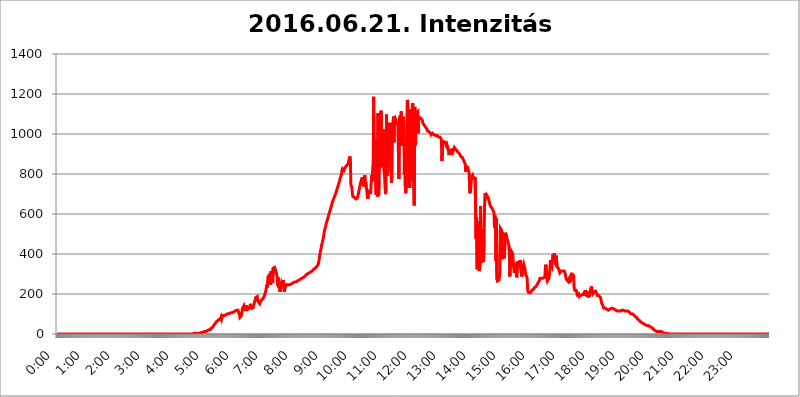
| Category | 2016.06.21. Intenzitás [W/m^2] |
|---|---|
| 0.0 | 0 |
| 0.0006944444444444445 | 0 |
| 0.001388888888888889 | 0 |
| 0.0020833333333333333 | 0 |
| 0.002777777777777778 | 0 |
| 0.003472222222222222 | 0 |
| 0.004166666666666667 | 0 |
| 0.004861111111111111 | 0 |
| 0.005555555555555556 | 0 |
| 0.0062499999999999995 | 0 |
| 0.006944444444444444 | 0 |
| 0.007638888888888889 | 0 |
| 0.008333333333333333 | 0 |
| 0.009027777777777779 | 0 |
| 0.009722222222222222 | 0 |
| 0.010416666666666666 | 0 |
| 0.011111111111111112 | 0 |
| 0.011805555555555555 | 0 |
| 0.012499999999999999 | 0 |
| 0.013194444444444444 | 0 |
| 0.013888888888888888 | 0 |
| 0.014583333333333332 | 0 |
| 0.015277777777777777 | 0 |
| 0.015972222222222224 | 0 |
| 0.016666666666666666 | 0 |
| 0.017361111111111112 | 0 |
| 0.018055555555555557 | 0 |
| 0.01875 | 0 |
| 0.019444444444444445 | 0 |
| 0.02013888888888889 | 0 |
| 0.020833333333333332 | 0 |
| 0.02152777777777778 | 0 |
| 0.022222222222222223 | 0 |
| 0.02291666666666667 | 0 |
| 0.02361111111111111 | 0 |
| 0.024305555555555556 | 0 |
| 0.024999999999999998 | 0 |
| 0.025694444444444447 | 0 |
| 0.02638888888888889 | 0 |
| 0.027083333333333334 | 0 |
| 0.027777777777777776 | 0 |
| 0.02847222222222222 | 0 |
| 0.029166666666666664 | 0 |
| 0.029861111111111113 | 0 |
| 0.030555555555555555 | 0 |
| 0.03125 | 0 |
| 0.03194444444444445 | 0 |
| 0.03263888888888889 | 0 |
| 0.03333333333333333 | 0 |
| 0.034027777777777775 | 0 |
| 0.034722222222222224 | 0 |
| 0.035416666666666666 | 0 |
| 0.036111111111111115 | 0 |
| 0.03680555555555556 | 0 |
| 0.0375 | 0 |
| 0.03819444444444444 | 0 |
| 0.03888888888888889 | 0 |
| 0.03958333333333333 | 0 |
| 0.04027777777777778 | 0 |
| 0.04097222222222222 | 0 |
| 0.041666666666666664 | 0 |
| 0.042361111111111106 | 0 |
| 0.04305555555555556 | 0 |
| 0.043750000000000004 | 0 |
| 0.044444444444444446 | 0 |
| 0.04513888888888889 | 0 |
| 0.04583333333333334 | 0 |
| 0.04652777777777778 | 0 |
| 0.04722222222222222 | 0 |
| 0.04791666666666666 | 0 |
| 0.04861111111111111 | 0 |
| 0.049305555555555554 | 0 |
| 0.049999999999999996 | 0 |
| 0.05069444444444445 | 0 |
| 0.051388888888888894 | 0 |
| 0.052083333333333336 | 0 |
| 0.05277777777777778 | 0 |
| 0.05347222222222222 | 0 |
| 0.05416666666666667 | 0 |
| 0.05486111111111111 | 0 |
| 0.05555555555555555 | 0 |
| 0.05625 | 0 |
| 0.05694444444444444 | 0 |
| 0.057638888888888885 | 0 |
| 0.05833333333333333 | 0 |
| 0.05902777777777778 | 0 |
| 0.059722222222222225 | 0 |
| 0.06041666666666667 | 0 |
| 0.061111111111111116 | 0 |
| 0.06180555555555556 | 0 |
| 0.0625 | 0 |
| 0.06319444444444444 | 0 |
| 0.06388888888888888 | 0 |
| 0.06458333333333334 | 0 |
| 0.06527777777777778 | 0 |
| 0.06597222222222222 | 0 |
| 0.06666666666666667 | 0 |
| 0.06736111111111111 | 0 |
| 0.06805555555555555 | 0 |
| 0.06874999999999999 | 0 |
| 0.06944444444444443 | 0 |
| 0.07013888888888889 | 0 |
| 0.07083333333333333 | 0 |
| 0.07152777777777779 | 0 |
| 0.07222222222222223 | 0 |
| 0.07291666666666667 | 0 |
| 0.07361111111111111 | 0 |
| 0.07430555555555556 | 0 |
| 0.075 | 0 |
| 0.07569444444444444 | 0 |
| 0.0763888888888889 | 0 |
| 0.07708333333333334 | 0 |
| 0.07777777777777778 | 0 |
| 0.07847222222222222 | 0 |
| 0.07916666666666666 | 0 |
| 0.0798611111111111 | 0 |
| 0.08055555555555556 | 0 |
| 0.08125 | 0 |
| 0.08194444444444444 | 0 |
| 0.08263888888888889 | 0 |
| 0.08333333333333333 | 0 |
| 0.08402777777777777 | 0 |
| 0.08472222222222221 | 0 |
| 0.08541666666666665 | 0 |
| 0.08611111111111112 | 0 |
| 0.08680555555555557 | 0 |
| 0.08750000000000001 | 0 |
| 0.08819444444444445 | 0 |
| 0.08888888888888889 | 0 |
| 0.08958333333333333 | 0 |
| 0.09027777777777778 | 0 |
| 0.09097222222222222 | 0 |
| 0.09166666666666667 | 0 |
| 0.09236111111111112 | 0 |
| 0.09305555555555556 | 0 |
| 0.09375 | 0 |
| 0.09444444444444444 | 0 |
| 0.09513888888888888 | 0 |
| 0.09583333333333333 | 0 |
| 0.09652777777777777 | 0 |
| 0.09722222222222222 | 0 |
| 0.09791666666666667 | 0 |
| 0.09861111111111111 | 0 |
| 0.09930555555555555 | 0 |
| 0.09999999999999999 | 0 |
| 0.10069444444444443 | 0 |
| 0.1013888888888889 | 0 |
| 0.10208333333333335 | 0 |
| 0.10277777777777779 | 0 |
| 0.10347222222222223 | 0 |
| 0.10416666666666667 | 0 |
| 0.10486111111111111 | 0 |
| 0.10555555555555556 | 0 |
| 0.10625 | 0 |
| 0.10694444444444444 | 0 |
| 0.1076388888888889 | 0 |
| 0.10833333333333334 | 0 |
| 0.10902777777777778 | 0 |
| 0.10972222222222222 | 0 |
| 0.1111111111111111 | 0 |
| 0.11180555555555556 | 0 |
| 0.11180555555555556 | 0 |
| 0.1125 | 0 |
| 0.11319444444444444 | 0 |
| 0.11388888888888889 | 0 |
| 0.11458333333333333 | 0 |
| 0.11527777777777777 | 0 |
| 0.11597222222222221 | 0 |
| 0.11666666666666665 | 0 |
| 0.1173611111111111 | 0 |
| 0.11805555555555557 | 0 |
| 0.11944444444444445 | 0 |
| 0.12013888888888889 | 0 |
| 0.12083333333333333 | 0 |
| 0.12152777777777778 | 0 |
| 0.12222222222222223 | 0 |
| 0.12291666666666667 | 0 |
| 0.12291666666666667 | 0 |
| 0.12361111111111112 | 0 |
| 0.12430555555555556 | 0 |
| 0.125 | 0 |
| 0.12569444444444444 | 0 |
| 0.12638888888888888 | 0 |
| 0.12708333333333333 | 0 |
| 0.16875 | 0 |
| 0.12847222222222224 | 0 |
| 0.12916666666666668 | 0 |
| 0.12986111111111112 | 0 |
| 0.13055555555555556 | 0 |
| 0.13125 | 0 |
| 0.13194444444444445 | 0 |
| 0.1326388888888889 | 0 |
| 0.13333333333333333 | 0 |
| 0.13402777777777777 | 0 |
| 0.13402777777777777 | 0 |
| 0.13472222222222222 | 0 |
| 0.13541666666666666 | 0 |
| 0.1361111111111111 | 0 |
| 0.13749999999999998 | 0 |
| 0.13819444444444443 | 0 |
| 0.1388888888888889 | 0 |
| 0.13958333333333334 | 0 |
| 0.14027777777777778 | 0 |
| 0.14097222222222222 | 0 |
| 0.14166666666666666 | 0 |
| 0.1423611111111111 | 0 |
| 0.14305555555555557 | 0 |
| 0.14375000000000002 | 0 |
| 0.14444444444444446 | 0 |
| 0.1451388888888889 | 0 |
| 0.1451388888888889 | 0 |
| 0.14652777777777778 | 0 |
| 0.14722222222222223 | 0 |
| 0.14791666666666667 | 0 |
| 0.1486111111111111 | 0 |
| 0.14930555555555555 | 0 |
| 0.15 | 0 |
| 0.15069444444444444 | 0 |
| 0.15138888888888888 | 0 |
| 0.15208333333333332 | 0 |
| 0.15277777777777776 | 0 |
| 0.15347222222222223 | 0 |
| 0.15416666666666667 | 0 |
| 0.15486111111111112 | 0 |
| 0.15555555555555556 | 0 |
| 0.15625 | 0 |
| 0.15694444444444444 | 0 |
| 0.15763888888888888 | 0 |
| 0.15833333333333333 | 0 |
| 0.15902777777777777 | 0 |
| 0.15972222222222224 | 0 |
| 0.16041666666666668 | 0 |
| 0.16111111111111112 | 0 |
| 0.16180555555555556 | 0 |
| 0.1625 | 0 |
| 0.16319444444444445 | 0 |
| 0.1638888888888889 | 0 |
| 0.16458333333333333 | 0 |
| 0.16527777777777777 | 0 |
| 0.16597222222222222 | 0 |
| 0.16666666666666666 | 0 |
| 0.1673611111111111 | 0 |
| 0.16805555555555554 | 0 |
| 0.16874999999999998 | 0 |
| 0.16944444444444443 | 0 |
| 0.17013888888888887 | 0 |
| 0.1708333333333333 | 0 |
| 0.17152777777777775 | 0 |
| 0.17222222222222225 | 0 |
| 0.1729166666666667 | 0 |
| 0.17361111111111113 | 0 |
| 0.17430555555555557 | 0 |
| 0.17500000000000002 | 0 |
| 0.17569444444444446 | 0 |
| 0.1763888888888889 | 0 |
| 0.17708333333333334 | 0 |
| 0.17777777777777778 | 0 |
| 0.17847222222222223 | 0 |
| 0.17916666666666667 | 0 |
| 0.1798611111111111 | 0 |
| 0.18055555555555555 | 0 |
| 0.18125 | 0 |
| 0.18194444444444444 | 0 |
| 0.1826388888888889 | 0 |
| 0.18333333333333335 | 0 |
| 0.1840277777777778 | 0 |
| 0.18472222222222223 | 0 |
| 0.18541666666666667 | 0 |
| 0.18611111111111112 | 0 |
| 0.18680555555555556 | 0 |
| 0.1875 | 0 |
| 0.18819444444444444 | 0 |
| 0.18888888888888888 | 0 |
| 0.18958333333333333 | 0 |
| 0.19027777777777777 | 0 |
| 0.1909722222222222 | 0 |
| 0.19166666666666665 | 3.525 |
| 0.19236111111111112 | 3.525 |
| 0.19305555555555554 | 3.525 |
| 0.19375 | 3.525 |
| 0.19444444444444445 | 3.525 |
| 0.1951388888888889 | 3.525 |
| 0.19583333333333333 | 3.525 |
| 0.19652777777777777 | 3.525 |
| 0.19722222222222222 | 3.525 |
| 0.19791666666666666 | 3.525 |
| 0.1986111111111111 | 3.525 |
| 0.19930555555555554 | 3.525 |
| 0.19999999999999998 | 3.525 |
| 0.20069444444444443 | 3.525 |
| 0.20138888888888887 | 7.887 |
| 0.2020833333333333 | 7.887 |
| 0.2027777777777778 | 7.887 |
| 0.2034722222222222 | 7.887 |
| 0.2041666666666667 | 7.887 |
| 0.20486111111111113 | 7.887 |
| 0.20555555555555557 | 7.887 |
| 0.20625000000000002 | 12.257 |
| 0.20694444444444446 | 12.257 |
| 0.2076388888888889 | 12.257 |
| 0.20833333333333334 | 12.257 |
| 0.20902777777777778 | 12.257 |
| 0.20972222222222223 | 12.257 |
| 0.21041666666666667 | 16.636 |
| 0.2111111111111111 | 16.636 |
| 0.21180555555555555 | 21.024 |
| 0.2125 | 21.024 |
| 0.21319444444444444 | 21.024 |
| 0.2138888888888889 | 21.024 |
| 0.21458333333333335 | 21.024 |
| 0.2152777777777778 | 25.419 |
| 0.21597222222222223 | 29.823 |
| 0.21666666666666667 | 29.823 |
| 0.21736111111111112 | 34.234 |
| 0.21805555555555556 | 34.234 |
| 0.21875 | 38.653 |
| 0.21944444444444444 | 43.079 |
| 0.22013888888888888 | 47.511 |
| 0.22083333333333333 | 47.511 |
| 0.22152777777777777 | 51.951 |
| 0.2222222222222222 | 56.398 |
| 0.22291666666666665 | 60.85 |
| 0.2236111111111111 | 60.85 |
| 0.22430555555555556 | 65.31 |
| 0.225 | 65.31 |
| 0.22569444444444445 | 69.775 |
| 0.2263888888888889 | 69.775 |
| 0.22708333333333333 | 74.246 |
| 0.22777777777777777 | 78.722 |
| 0.22847222222222222 | 78.722 |
| 0.22916666666666666 | 74.246 |
| 0.2298611111111111 | 83.205 |
| 0.23055555555555554 | 74.246 |
| 0.23124999999999998 | 83.205 |
| 0.23194444444444443 | 83.205 |
| 0.23263888888888887 | 92.184 |
| 0.2333333333333333 | 92.184 |
| 0.2340277777777778 | 92.184 |
| 0.2347222222222222 | 92.184 |
| 0.2354166666666667 | 96.682 |
| 0.23611111111111113 | 96.682 |
| 0.23680555555555557 | 96.682 |
| 0.23750000000000002 | 101.184 |
| 0.23819444444444446 | 101.184 |
| 0.2388888888888889 | 101.184 |
| 0.23958333333333334 | 101.184 |
| 0.24027777777777778 | 101.184 |
| 0.24097222222222223 | 101.184 |
| 0.24166666666666667 | 101.184 |
| 0.2423611111111111 | 105.69 |
| 0.24305555555555555 | 105.69 |
| 0.24375 | 105.69 |
| 0.24444444444444446 | 105.69 |
| 0.24513888888888888 | 105.69 |
| 0.24583333333333335 | 110.201 |
| 0.2465277777777778 | 110.201 |
| 0.24722222222222223 | 110.201 |
| 0.24791666666666667 | 110.201 |
| 0.24861111111111112 | 114.716 |
| 0.24930555555555556 | 114.716 |
| 0.25 | 114.716 |
| 0.25069444444444444 | 114.716 |
| 0.2513888888888889 | 119.235 |
| 0.2520833333333333 | 119.235 |
| 0.25277777777777777 | 119.235 |
| 0.2534722222222222 | 119.235 |
| 0.25416666666666665 | 119.235 |
| 0.2548611111111111 | 119.235 |
| 0.2555555555555556 | 96.682 |
| 0.25625000000000003 | 83.205 |
| 0.2569444444444445 | 87.692 |
| 0.2576388888888889 | 87.692 |
| 0.25833333333333336 | 92.184 |
| 0.2590277777777778 | 92.184 |
| 0.25972222222222224 | 128.284 |
| 0.2604166666666667 | 128.284 |
| 0.2611111111111111 | 137.347 |
| 0.26180555555555557 | 123.758 |
| 0.2625 | 132.814 |
| 0.26319444444444445 | 128.284 |
| 0.2638888888888889 | 114.716 |
| 0.26458333333333334 | 110.201 |
| 0.2652777777777778 | 141.884 |
| 0.2659722222222222 | 132.814 |
| 0.26666666666666666 | 128.284 |
| 0.2673611111111111 | 123.758 |
| 0.26805555555555555 | 128.284 |
| 0.26875 | 128.284 |
| 0.26944444444444443 | 128.284 |
| 0.2701388888888889 | 137.347 |
| 0.2708333333333333 | 150.964 |
| 0.27152777777777776 | 137.347 |
| 0.2722222222222222 | 141.884 |
| 0.27291666666666664 | 128.284 |
| 0.2736111111111111 | 128.284 |
| 0.2743055555555555 | 128.284 |
| 0.27499999999999997 | 132.814 |
| 0.27569444444444446 | 146.423 |
| 0.27638888888888885 | 155.509 |
| 0.27708333333333335 | 164.605 |
| 0.2777777777777778 | 169.156 |
| 0.27847222222222223 | 182.82 |
| 0.2791666666666667 | 178.264 |
| 0.2798611111111111 | 182.82 |
| 0.28055555555555556 | 187.378 |
| 0.28125 | 169.156 |
| 0.28194444444444444 | 160.056 |
| 0.2826388888888889 | 155.509 |
| 0.2833333333333333 | 155.509 |
| 0.28402777777777777 | 150.964 |
| 0.2847222222222222 | 155.509 |
| 0.28541666666666665 | 164.605 |
| 0.28611111111111115 | 169.156 |
| 0.28680555555555554 | 169.156 |
| 0.28750000000000003 | 173.709 |
| 0.2881944444444445 | 173.709 |
| 0.2888888888888889 | 178.264 |
| 0.28958333333333336 | 182.82 |
| 0.2902777777777778 | 187.378 |
| 0.29097222222222224 | 196.497 |
| 0.2916666666666667 | 205.62 |
| 0.2923611111111111 | 214.746 |
| 0.29305555555555557 | 223.873 |
| 0.29375 | 246.689 |
| 0.29444444444444445 | 233 |
| 0.2951388888888889 | 260.373 |
| 0.29583333333333334 | 292.259 |
| 0.2965277777777778 | 283.156 |
| 0.2972222222222222 | 292.259 |
| 0.29791666666666666 | 301.354 |
| 0.2986111111111111 | 305.898 |
| 0.29930555555555555 | 246.689 |
| 0.3 | 314.98 |
| 0.30069444444444443 | 310.44 |
| 0.3013888888888889 | 314.98 |
| 0.3020833333333333 | 255.813 |
| 0.30277777777777776 | 328.584 |
| 0.3034722222222222 | 324.052 |
| 0.30416666666666664 | 333.113 |
| 0.3048611111111111 | 333.113 |
| 0.3055555555555555 | 328.584 |
| 0.30624999999999997 | 328.584 |
| 0.3069444444444444 | 310.44 |
| 0.3076388888888889 | 314.98 |
| 0.30833333333333335 | 287.709 |
| 0.3090277777777778 | 242.127 |
| 0.30972222222222223 | 283.156 |
| 0.3104166666666667 | 233 |
| 0.3111111111111111 | 260.373 |
| 0.31180555555555556 | 228.436 |
| 0.3125 | 210.182 |
| 0.31319444444444444 | 233 |
| 0.3138888888888889 | 242.127 |
| 0.3145833333333333 | 255.813 |
| 0.31527777777777777 | 260.373 |
| 0.3159722222222222 | 242.127 |
| 0.31666666666666665 | 269.49 |
| 0.31736111111111115 | 274.047 |
| 0.31805555555555554 | 264.932 |
| 0.31875000000000003 | 210.182 |
| 0.3194444444444445 | 251.251 |
| 0.3201388888888889 | 237.564 |
| 0.32083333333333336 | 233 |
| 0.3215277777777778 | 242.127 |
| 0.32222222222222224 | 246.689 |
| 0.3229166666666667 | 242.127 |
| 0.3236111111111111 | 242.127 |
| 0.32430555555555557 | 246.689 |
| 0.325 | 246.689 |
| 0.32569444444444445 | 246.689 |
| 0.3263888888888889 | 246.689 |
| 0.32708333333333334 | 251.251 |
| 0.3277777777777778 | 251.251 |
| 0.3284722222222222 | 251.251 |
| 0.32916666666666666 | 255.813 |
| 0.3298611111111111 | 255.813 |
| 0.33055555555555555 | 255.813 |
| 0.33125 | 255.813 |
| 0.33194444444444443 | 260.373 |
| 0.3326388888888889 | 260.373 |
| 0.3333333333333333 | 260.373 |
| 0.3340277777777778 | 260.373 |
| 0.3347222222222222 | 260.373 |
| 0.3354166666666667 | 260.373 |
| 0.3361111111111111 | 264.932 |
| 0.3368055555555556 | 264.932 |
| 0.33749999999999997 | 269.49 |
| 0.33819444444444446 | 269.49 |
| 0.33888888888888885 | 269.49 |
| 0.33958333333333335 | 269.49 |
| 0.34027777777777773 | 274.047 |
| 0.34097222222222223 | 274.047 |
| 0.3416666666666666 | 274.047 |
| 0.3423611111111111 | 278.603 |
| 0.3430555555555555 | 278.603 |
| 0.34375 | 278.603 |
| 0.3444444444444445 | 283.156 |
| 0.3451388888888889 | 283.156 |
| 0.3458333333333334 | 287.709 |
| 0.34652777777777777 | 287.709 |
| 0.34722222222222227 | 287.709 |
| 0.34791666666666665 | 292.259 |
| 0.34861111111111115 | 292.259 |
| 0.34930555555555554 | 296.808 |
| 0.35000000000000003 | 296.808 |
| 0.3506944444444444 | 301.354 |
| 0.3513888888888889 | 301.354 |
| 0.3520833333333333 | 301.354 |
| 0.3527777777777778 | 305.898 |
| 0.3534722222222222 | 305.898 |
| 0.3541666666666667 | 305.898 |
| 0.3548611111111111 | 310.44 |
| 0.35555555555555557 | 310.44 |
| 0.35625 | 310.44 |
| 0.35694444444444445 | 314.98 |
| 0.3576388888888889 | 314.98 |
| 0.35833333333333334 | 319.517 |
| 0.3590277777777778 | 319.517 |
| 0.3597222222222222 | 324.052 |
| 0.36041666666666666 | 324.052 |
| 0.3611111111111111 | 324.052 |
| 0.36180555555555555 | 328.584 |
| 0.3625 | 333.113 |
| 0.36319444444444443 | 333.113 |
| 0.3638888888888889 | 337.639 |
| 0.3645833333333333 | 337.639 |
| 0.3652777777777778 | 342.162 |
| 0.3659722222222222 | 346.682 |
| 0.3666666666666667 | 360.221 |
| 0.3673611111111111 | 373.729 |
| 0.3680555555555556 | 391.685 |
| 0.36874999999999997 | 405.108 |
| 0.36944444444444446 | 418.492 |
| 0.37013888888888885 | 431.833 |
| 0.37083333333333335 | 445.129 |
| 0.37152777777777773 | 453.968 |
| 0.37222222222222223 | 462.786 |
| 0.3729166666666666 | 475.972 |
| 0.3736111111111111 | 489.108 |
| 0.3743055555555555 | 506.542 |
| 0.375 | 519.555 |
| 0.3756944444444445 | 528.2 |
| 0.3763888888888889 | 536.82 |
| 0.3770833333333334 | 549.704 |
| 0.37777777777777777 | 558.261 |
| 0.37847222222222227 | 566.793 |
| 0.37916666666666665 | 575.299 |
| 0.37986111111111115 | 583.779 |
| 0.38055555555555554 | 592.233 |
| 0.38125000000000003 | 600.661 |
| 0.3819444444444444 | 609.062 |
| 0.3826388888888889 | 617.436 |
| 0.3833333333333333 | 625.784 |
| 0.3840277777777778 | 634.105 |
| 0.3847222222222222 | 642.4 |
| 0.3854166666666667 | 654.791 |
| 0.3861111111111111 | 658.909 |
| 0.38680555555555557 | 667.123 |
| 0.3875 | 675.311 |
| 0.38819444444444445 | 679.395 |
| 0.3888888888888889 | 687.544 |
| 0.38958333333333334 | 691.608 |
| 0.3902777777777778 | 699.717 |
| 0.3909722222222222 | 707.8 |
| 0.39166666666666666 | 715.858 |
| 0.3923611111111111 | 723.889 |
| 0.39305555555555555 | 731.896 |
| 0.39375 | 739.877 |
| 0.39444444444444443 | 747.834 |
| 0.3951388888888889 | 755.766 |
| 0.3958333333333333 | 763.674 |
| 0.3965277777777778 | 775.492 |
| 0.3972222222222222 | 783.342 |
| 0.3979166666666667 | 791.169 |
| 0.3986111111111111 | 798.974 |
| 0.3993055555555556 | 818.392 |
| 0.39999999999999997 | 826.123 |
| 0.40069444444444446 | 826.123 |
| 0.40138888888888885 | 826.123 |
| 0.40208333333333335 | 818.392 |
| 0.40277777777777773 | 826.123 |
| 0.40347222222222223 | 829.981 |
| 0.4041666666666666 | 833.834 |
| 0.4048611111111111 | 837.682 |
| 0.4055555555555555 | 841.526 |
| 0.40625 | 845.365 |
| 0.4069444444444445 | 845.365 |
| 0.4076388888888889 | 849.199 |
| 0.4083333333333334 | 856.855 |
| 0.40902777777777777 | 868.305 |
| 0.40972222222222227 | 872.114 |
| 0.41041666666666665 | 887.309 |
| 0.41111111111111115 | 864.493 |
| 0.41180555555555554 | 747.834 |
| 0.41250000000000003 | 743.859 |
| 0.4131944444444444 | 731.896 |
| 0.4138888888888889 | 703.762 |
| 0.4145833333333333 | 687.544 |
| 0.4152777777777778 | 683.473 |
| 0.4159722222222222 | 683.473 |
| 0.4166666666666667 | 683.473 |
| 0.4173611111111111 | 687.544 |
| 0.41805555555555557 | 683.473 |
| 0.41875 | 675.311 |
| 0.41944444444444445 | 671.22 |
| 0.4201388888888889 | 675.311 |
| 0.42083333333333334 | 679.395 |
| 0.4215277777777778 | 687.544 |
| 0.4222222222222222 | 699.717 |
| 0.42291666666666666 | 711.832 |
| 0.4236111111111111 | 723.889 |
| 0.42430555555555555 | 735.89 |
| 0.425 | 751.803 |
| 0.42569444444444443 | 759.723 |
| 0.4263888888888889 | 755.766 |
| 0.4270833333333333 | 763.674 |
| 0.4277777777777778 | 783.342 |
| 0.4284722222222222 | 743.859 |
| 0.4291666666666667 | 743.859 |
| 0.4298611111111111 | 783.342 |
| 0.4305555555555556 | 735.89 |
| 0.43124999999999997 | 795.074 |
| 0.43194444444444446 | 735.89 |
| 0.43263888888888885 | 759.723 |
| 0.43333333333333335 | 739.877 |
| 0.43402777777777773 | 719.877 |
| 0.43472222222222223 | 723.889 |
| 0.4354166666666666 | 675.311 |
| 0.4361111111111111 | 687.544 |
| 0.4368055555555555 | 687.544 |
| 0.4375 | 711.832 |
| 0.4381944444444445 | 715.858 |
| 0.4388888888888889 | 711.832 |
| 0.4395833333333334 | 707.8 |
| 0.44027777777777777 | 703.762 |
| 0.44097222222222227 | 795.074 |
| 0.44166666666666665 | 763.674 |
| 0.44236111111111115 | 763.674 |
| 0.44305555555555554 | 841.526 |
| 0.44375000000000003 | 1186.03 |
| 0.4444444444444444 | 917.534 |
| 0.4451388888888889 | 856.855 |
| 0.4458333333333333 | 841.526 |
| 0.4465277777777778 | 759.723 |
| 0.4472222222222222 | 695.666 |
| 0.4479166666666667 | 691.608 |
| 0.4486111111111111 | 973.772 |
| 0.44930555555555557 | 687.544 |
| 0.45 | 1105.019 |
| 0.45069444444444445 | 691.608 |
| 0.4513888888888889 | 771.559 |
| 0.45208333333333334 | 875.918 |
| 0.4527777777777778 | 1014.852 |
| 0.4534722222222222 | 917.534 |
| 0.45416666666666666 | 1116.426 |
| 0.4548611111111111 | 833.834 |
| 0.45555555555555555 | 902.447 |
| 0.45625 | 887.309 |
| 0.45694444444444443 | 1022.323 |
| 0.4576388888888889 | 845.365 |
| 0.4583333333333333 | 818.392 |
| 0.4590277777777778 | 798.974 |
| 0.4597222222222222 | 735.89 |
| 0.4604166666666667 | 699.717 |
| 0.4611111111111111 | 727.896 |
| 0.4618055555555556 | 1097.437 |
| 0.46249999999999997 | 791.169 |
| 0.46319444444444446 | 818.392 |
| 0.46388888888888885 | 810.641 |
| 0.46458333333333335 | 1029.798 |
| 0.46527777777777773 | 868.305 |
| 0.46597222222222223 | 1044.762 |
| 0.4666666666666666 | 1056.004 |
| 0.4673611111111111 | 962.555 |
| 0.4680555555555555 | 826.123 |
| 0.46875 | 755.766 |
| 0.4694444444444445 | 791.169 |
| 0.4701388888888889 | 1052.255 |
| 0.4708333333333334 | 984.98 |
| 0.47152777777777777 | 1086.097 |
| 0.47222222222222227 | 958.814 |
| 0.47291666666666665 | 1089.873 |
| 0.47361111111111115 | 1067.267 |
| 0.47430555555555554 | 1074.789 |
| 0.47500000000000003 | 1067.267 |
| 0.4756944444444444 | 1056.004 |
| 0.4763888888888889 | 1056.004 |
| 0.4770833333333333 | 1052.255 |
| 0.4777777777777778 | 1048.508 |
| 0.4784722222222222 | 902.447 |
| 0.4791666666666667 | 775.492 |
| 0.4798611111111111 | 1078.555 |
| 0.48055555555555557 | 1078.555 |
| 0.48125 | 1093.653 |
| 0.48194444444444445 | 1074.789 |
| 0.4826388888888889 | 1112.618 |
| 0.48333333333333334 | 940.082 |
| 0.4840277777777778 | 1026.06 |
| 0.4847222222222222 | 1011.118 |
| 0.48541666666666666 | 1086.097 |
| 0.4861111111111111 | 1037.277 |
| 0.48680555555555555 | 798.974 |
| 0.4875 | 883.516 |
| 0.48819444444444443 | 739.877 |
| 0.4888888888888889 | 703.762 |
| 0.4895833333333333 | 798.974 |
| 0.4902777777777778 | 1033.537 |
| 0.4909722222222222 | 1170.358 |
| 0.4916666666666667 | 1158.689 |
| 0.4923611111111111 | 1112.618 |
| 0.4930555555555556 | 731.896 |
| 0.49374999999999997 | 747.834 |
| 0.49444444444444446 | 731.896 |
| 0.49513888888888885 | 1124.056 |
| 0.49583333333333335 | 1067.267 |
| 0.49652777777777773 | 763.674 |
| 0.49722222222222223 | 856.855 |
| 0.4979166666666666 | 1014.852 |
| 0.4986111111111111 | 1154.814 |
| 0.4993055555555555 | 917.534 |
| 0.5 | 719.877 |
| 0.5006944444444444 | 642.4 |
| 0.5013888888888889 | 1135.543 |
| 0.5020833333333333 | 943.832 |
| 0.5027777777777778 | 955.071 |
| 0.5034722222222222 | 1105.019 |
| 0.5041666666666667 | 1108.816 |
| 0.5048611111111111 | 1101.226 |
| 0.5055555555555555 | 1112.618 |
| 0.50625 | 1003.65 |
| 0.5069444444444444 | 1089.873 |
| 0.5076388888888889 | 1078.555 |
| 0.5083333333333333 | 1082.324 |
| 0.5090277777777777 | 1078.555 |
| 0.5097222222222222 | 1078.555 |
| 0.5104166666666666 | 1078.555 |
| 0.5111111111111112 | 1074.789 |
| 0.5118055555555555 | 1071.027 |
| 0.5125000000000001 | 1059.756 |
| 0.5131944444444444 | 1052.255 |
| 0.513888888888889 | 1048.508 |
| 0.5145833333333333 | 1044.762 |
| 0.5152777777777778 | 1041.019 |
| 0.5159722222222222 | 1037.277 |
| 0.5166666666666667 | 1033.537 |
| 0.517361111111111 | 1029.798 |
| 0.5180555555555556 | 1029.798 |
| 0.5187499999999999 | 1022.323 |
| 0.5194444444444445 | 1014.852 |
| 0.5201388888888888 | 1014.852 |
| 0.5208333333333334 | 1014.852 |
| 0.5215277777777778 | 1011.118 |
| 0.5222222222222223 | 1007.383 |
| 0.5229166666666667 | 1007.383 |
| 0.5236111111111111 | 1003.65 |
| 0.5243055555555556 | 996.182 |
| 0.525 | 999.916 |
| 0.5256944444444445 | 999.916 |
| 0.5263888888888889 | 1003.65 |
| 0.5270833333333333 | 999.916 |
| 0.5277777777777778 | 999.916 |
| 0.5284722222222222 | 996.182 |
| 0.5291666666666667 | 996.182 |
| 0.5298611111111111 | 996.182 |
| 0.5305555555555556 | 992.448 |
| 0.53125 | 988.714 |
| 0.5319444444444444 | 988.714 |
| 0.5326388888888889 | 992.448 |
| 0.5333333333333333 | 992.448 |
| 0.5340277777777778 | 988.714 |
| 0.5347222222222222 | 984.98 |
| 0.5354166666666667 | 984.98 |
| 0.5361111111111111 | 984.98 |
| 0.5368055555555555 | 984.98 |
| 0.5375 | 981.244 |
| 0.5381944444444444 | 977.508 |
| 0.5388888888888889 | 962.555 |
| 0.5395833333333333 | 864.493 |
| 0.5402777777777777 | 947.58 |
| 0.5409722222222222 | 955.071 |
| 0.5416666666666666 | 962.555 |
| 0.5423611111111112 | 962.555 |
| 0.5430555555555555 | 958.814 |
| 0.5437500000000001 | 958.814 |
| 0.5444444444444444 | 955.071 |
| 0.545138888888889 | 955.071 |
| 0.5458333333333333 | 940.082 |
| 0.5465277777777778 | 947.58 |
| 0.5472222222222222 | 947.58 |
| 0.5479166666666667 | 943.832 |
| 0.548611111111111 | 925.06 |
| 0.5493055555555556 | 894.885 |
| 0.5499999999999999 | 898.668 |
| 0.5506944444444445 | 913.766 |
| 0.5513888888888888 | 898.668 |
| 0.5520833333333334 | 921.298 |
| 0.5527777777777778 | 898.668 |
| 0.5534722222222223 | 925.06 |
| 0.5541666666666667 | 917.534 |
| 0.5548611111111111 | 928.819 |
| 0.5555555555555556 | 917.534 |
| 0.55625 | 925.06 |
| 0.5569444444444445 | 932.576 |
| 0.5576388888888889 | 928.819 |
| 0.5583333333333333 | 925.06 |
| 0.5590277777777778 | 925.06 |
| 0.5597222222222222 | 921.298 |
| 0.5604166666666667 | 917.534 |
| 0.5611111111111111 | 917.534 |
| 0.5618055555555556 | 909.996 |
| 0.5625 | 906.223 |
| 0.5631944444444444 | 906.223 |
| 0.5638888888888889 | 902.447 |
| 0.5645833333333333 | 898.668 |
| 0.5652777777777778 | 894.885 |
| 0.5659722222222222 | 887.309 |
| 0.5666666666666667 | 887.309 |
| 0.5673611111111111 | 883.516 |
| 0.5680555555555555 | 883.516 |
| 0.56875 | 875.918 |
| 0.5694444444444444 | 875.918 |
| 0.5701388888888889 | 868.305 |
| 0.5708333333333333 | 860.676 |
| 0.5715277777777777 | 860.676 |
| 0.5722222222222222 | 849.199 |
| 0.5729166666666666 | 810.641 |
| 0.5736111111111112 | 837.682 |
| 0.5743055555555555 | 837.682 |
| 0.5750000000000001 | 837.682 |
| 0.5756944444444444 | 833.834 |
| 0.576388888888889 | 833.834 |
| 0.5770833333333333 | 829.981 |
| 0.5777777777777778 | 802.868 |
| 0.5784722222222222 | 703.762 |
| 0.5791666666666667 | 707.8 |
| 0.579861111111111 | 719.877 |
| 0.5805555555555556 | 759.723 |
| 0.5812499999999999 | 787.258 |
| 0.5819444444444445 | 787.258 |
| 0.5826388888888888 | 795.074 |
| 0.5833333333333334 | 787.258 |
| 0.5840277777777778 | 787.258 |
| 0.5847222222222223 | 783.342 |
| 0.5854166666666667 | 775.492 |
| 0.5861111111111111 | 783.342 |
| 0.5868055555555556 | 783.342 |
| 0.5875 | 475.972 |
| 0.5881944444444445 | 583.779 |
| 0.5888888888888889 | 324.052 |
| 0.5895833333333333 | 342.162 |
| 0.5902777777777778 | 562.53 |
| 0.5909722222222222 | 328.584 |
| 0.5916666666666667 | 314.98 |
| 0.5923611111111111 | 324.052 |
| 0.5930555555555556 | 337.639 |
| 0.59375 | 638.256 |
| 0.5944444444444444 | 369.23 |
| 0.5951388888888889 | 355.712 |
| 0.5958333333333333 | 391.685 |
| 0.5965277777777778 | 378.224 |
| 0.5972222222222222 | 523.88 |
| 0.5979166666666667 | 360.221 |
| 0.5986111111111111 | 475.972 |
| 0.5993055555555555 | 638.256 |
| 0.6 | 703.762 |
| 0.6006944444444444 | 699.717 |
| 0.6013888888888889 | 687.544 |
| 0.6020833333333333 | 695.666 |
| 0.6027777777777777 | 691.608 |
| 0.6034722222222222 | 687.544 |
| 0.6041666666666666 | 683.473 |
| 0.6048611111111112 | 675.311 |
| 0.6055555555555555 | 667.123 |
| 0.6062500000000001 | 654.791 |
| 0.6069444444444444 | 646.537 |
| 0.607638888888889 | 638.256 |
| 0.6083333333333333 | 634.105 |
| 0.6090277777777778 | 634.105 |
| 0.6097222222222222 | 629.948 |
| 0.6104166666666667 | 625.784 |
| 0.611111111111111 | 617.436 |
| 0.6118055555555556 | 617.436 |
| 0.6124999999999999 | 609.062 |
| 0.6131944444444445 | 532.513 |
| 0.6138888888888888 | 592.233 |
| 0.6145833333333334 | 545.416 |
| 0.6152777777777778 | 364.728 |
| 0.6159722222222223 | 579.542 |
| 0.6166666666666667 | 274.047 |
| 0.6173611111111111 | 264.932 |
| 0.6180555555555556 | 264.932 |
| 0.61875 | 264.932 |
| 0.6194444444444445 | 269.49 |
| 0.6201388888888889 | 274.047 |
| 0.6208333333333333 | 301.354 |
| 0.6215277777777778 | 528.2 |
| 0.6222222222222222 | 523.88 |
| 0.6229166666666667 | 519.555 |
| 0.6236111111111111 | 506.542 |
| 0.6243055555555556 | 373.729 |
| 0.625 | 502.192 |
| 0.6256944444444444 | 506.542 |
| 0.6263888888888889 | 493.475 |
| 0.6270833333333333 | 378.224 |
| 0.6277777777777778 | 458.38 |
| 0.6284722222222222 | 506.542 |
| 0.6291666666666667 | 502.192 |
| 0.6298611111111111 | 493.475 |
| 0.6305555555555555 | 480.356 |
| 0.63125 | 471.582 |
| 0.6319444444444444 | 462.786 |
| 0.6326388888888889 | 453.968 |
| 0.6333333333333333 | 445.129 |
| 0.6340277777777777 | 405.108 |
| 0.6347222222222222 | 287.709 |
| 0.6354166666666666 | 287.709 |
| 0.6361111111111112 | 378.224 |
| 0.6368055555555555 | 414.035 |
| 0.6375000000000001 | 414.035 |
| 0.6381944444444444 | 409.574 |
| 0.638888888888889 | 400.638 |
| 0.6395833333333333 | 360.221 |
| 0.6402777777777778 | 328.584 |
| 0.6409722222222222 | 305.898 |
| 0.6416666666666667 | 314.98 |
| 0.642361111111111 | 346.682 |
| 0.6430555555555556 | 355.712 |
| 0.6437499999999999 | 328.584 |
| 0.6444444444444445 | 283.156 |
| 0.6451388888888888 | 342.162 |
| 0.6458333333333334 | 364.728 |
| 0.6465277777777778 | 364.728 |
| 0.6472222222222223 | 360.221 |
| 0.6479166666666667 | 346.682 |
| 0.6486111111111111 | 328.584 |
| 0.6493055555555556 | 369.23 |
| 0.65 | 369.23 |
| 0.6506944444444445 | 369.23 |
| 0.6513888888888889 | 287.709 |
| 0.6520833333333333 | 287.709 |
| 0.6527777777777778 | 319.517 |
| 0.6534722222222222 | 342.162 |
| 0.6541666666666667 | 351.198 |
| 0.6548611111111111 | 346.682 |
| 0.6555555555555556 | 333.113 |
| 0.65625 | 319.517 |
| 0.6569444444444444 | 296.808 |
| 0.6576388888888889 | 296.808 |
| 0.6583333333333333 | 287.709 |
| 0.6590277777777778 | 278.603 |
| 0.6597222222222222 | 223.873 |
| 0.6604166666666667 | 210.182 |
| 0.6611111111111111 | 210.182 |
| 0.6618055555555555 | 210.182 |
| 0.6625 | 205.62 |
| 0.6631944444444444 | 201.058 |
| 0.6638888888888889 | 205.62 |
| 0.6645833333333333 | 210.182 |
| 0.6652777777777777 | 214.746 |
| 0.6659722222222222 | 219.309 |
| 0.6666666666666666 | 219.309 |
| 0.6673611111111111 | 223.873 |
| 0.6680555555555556 | 223.873 |
| 0.6687500000000001 | 228.436 |
| 0.6694444444444444 | 233 |
| 0.6701388888888888 | 233 |
| 0.6708333333333334 | 237.564 |
| 0.6715277777777778 | 237.564 |
| 0.6722222222222222 | 242.127 |
| 0.6729166666666666 | 246.689 |
| 0.6736111111111112 | 251.251 |
| 0.6743055555555556 | 255.813 |
| 0.6749999999999999 | 255.813 |
| 0.6756944444444444 | 260.373 |
| 0.6763888888888889 | 269.49 |
| 0.6770833333333334 | 278.603 |
| 0.6777777777777777 | 278.603 |
| 0.6784722222222223 | 278.603 |
| 0.6791666666666667 | 278.603 |
| 0.6798611111111111 | 278.603 |
| 0.6805555555555555 | 278.603 |
| 0.68125 | 278.603 |
| 0.6819444444444445 | 278.603 |
| 0.6826388888888889 | 283.156 |
| 0.6833333333333332 | 283.156 |
| 0.6840277777777778 | 292.259 |
| 0.6847222222222222 | 337.639 |
| 0.6854166666666667 | 346.682 |
| 0.686111111111111 | 314.98 |
| 0.6868055555555556 | 278.603 |
| 0.6875 | 264.932 |
| 0.6881944444444444 | 264.932 |
| 0.688888888888889 | 269.49 |
| 0.6895833333333333 | 278.603 |
| 0.6902777777777778 | 296.808 |
| 0.6909722222222222 | 324.052 |
| 0.6916666666666668 | 369.23 |
| 0.6923611111111111 | 342.162 |
| 0.6930555555555555 | 337.639 |
| 0.69375 | 333.113 |
| 0.6944444444444445 | 337.639 |
| 0.6951388888888889 | 396.164 |
| 0.6958333333333333 | 396.164 |
| 0.6965277777777777 | 369.23 |
| 0.6972222222222223 | 405.108 |
| 0.6979166666666666 | 364.728 |
| 0.6986111111111111 | 369.23 |
| 0.6993055555555556 | 346.682 |
| 0.7000000000000001 | 391.685 |
| 0.7006944444444444 | 337.639 |
| 0.7013888888888888 | 333.113 |
| 0.7020833333333334 | 337.639 |
| 0.7027777777777778 | 328.584 |
| 0.7034722222222222 | 324.052 |
| 0.7041666666666666 | 314.98 |
| 0.7048611111111112 | 305.898 |
| 0.7055555555555556 | 305.898 |
| 0.7062499999999999 | 305.898 |
| 0.7069444444444444 | 314.98 |
| 0.7076388888888889 | 314.98 |
| 0.7083333333333334 | 310.44 |
| 0.7090277777777777 | 314.98 |
| 0.7097222222222223 | 314.98 |
| 0.7104166666666667 | 310.44 |
| 0.7111111111111111 | 314.98 |
| 0.7118055555555555 | 310.44 |
| 0.7125 | 301.354 |
| 0.7131944444444445 | 287.709 |
| 0.7138888888888889 | 274.047 |
| 0.7145833333333332 | 269.49 |
| 0.7152777777777778 | 269.49 |
| 0.7159722222222222 | 264.932 |
| 0.7166666666666667 | 269.49 |
| 0.717361111111111 | 274.047 |
| 0.7180555555555556 | 260.373 |
| 0.71875 | 264.932 |
| 0.7194444444444444 | 264.932 |
| 0.720138888888889 | 264.932 |
| 0.7208333333333333 | 296.808 |
| 0.7215277777777778 | 305.898 |
| 0.7222222222222222 | 287.709 |
| 0.7229166666666668 | 278.603 |
| 0.7236111111111111 | 296.808 |
| 0.7243055555555555 | 287.709 |
| 0.725 | 228.436 |
| 0.7256944444444445 | 219.309 |
| 0.7263888888888889 | 219.309 |
| 0.7270833333333333 | 219.309 |
| 0.7277777777777777 | 219.309 |
| 0.7284722222222223 | 210.182 |
| 0.7291666666666666 | 196.497 |
| 0.7298611111111111 | 191.937 |
| 0.7305555555555556 | 191.937 |
| 0.7312500000000001 | 201.058 |
| 0.7319444444444444 | 187.378 |
| 0.7326388888888888 | 187.378 |
| 0.7333333333333334 | 191.937 |
| 0.7340277777777778 | 191.937 |
| 0.7347222222222222 | 191.937 |
| 0.7354166666666666 | 196.497 |
| 0.7361111111111112 | 196.497 |
| 0.7368055555555556 | 201.058 |
| 0.7374999999999999 | 201.058 |
| 0.7381944444444444 | 201.058 |
| 0.7388888888888889 | 196.497 |
| 0.7395833333333334 | 214.746 |
| 0.7402777777777777 | 191.937 |
| 0.7409722222222223 | 219.309 |
| 0.7416666666666667 | 223.873 |
| 0.7423611111111111 | 205.62 |
| 0.7430555555555555 | 187.378 |
| 0.74375 | 210.182 |
| 0.7444444444444445 | 205.62 |
| 0.7451388888888889 | 182.82 |
| 0.7458333333333332 | 201.058 |
| 0.7465277777777778 | 187.378 |
| 0.7472222222222222 | 210.182 |
| 0.7479166666666667 | 223.873 |
| 0.748611111111111 | 223.873 |
| 0.7493055555555556 | 237.564 |
| 0.75 | 214.746 |
| 0.7506944444444444 | 210.182 |
| 0.751388888888889 | 201.058 |
| 0.7520833333333333 | 201.058 |
| 0.7527777777777778 | 210.182 |
| 0.7534722222222222 | 214.746 |
| 0.7541666666666668 | 214.746 |
| 0.7548611111111111 | 214.746 |
| 0.7555555555555555 | 210.182 |
| 0.75625 | 205.62 |
| 0.7569444444444445 | 201.058 |
| 0.7576388888888889 | 191.937 |
| 0.7583333333333333 | 191.937 |
| 0.7590277777777777 | 196.497 |
| 0.7597222222222223 | 191.937 |
| 0.7604166666666666 | 187.378 |
| 0.7611111111111111 | 187.378 |
| 0.7618055555555556 | 182.82 |
| 0.7625000000000001 | 173.709 |
| 0.7631944444444444 | 160.056 |
| 0.7638888888888888 | 150.964 |
| 0.7645833333333334 | 146.423 |
| 0.7652777777777778 | 141.884 |
| 0.7659722222222222 | 137.347 |
| 0.7666666666666666 | 128.284 |
| 0.7673611111111112 | 128.284 |
| 0.7680555555555556 | 123.758 |
| 0.7687499999999999 | 128.284 |
| 0.7694444444444444 | 128.284 |
| 0.7701388888888889 | 123.758 |
| 0.7708333333333334 | 123.758 |
| 0.7715277777777777 | 119.235 |
| 0.7722222222222223 | 119.235 |
| 0.7729166666666667 | 119.235 |
| 0.7736111111111111 | 114.716 |
| 0.7743055555555555 | 123.758 |
| 0.775 | 123.758 |
| 0.7756944444444445 | 128.284 |
| 0.7763888888888889 | 128.284 |
| 0.7770833333333332 | 128.284 |
| 0.7777777777777778 | 128.284 |
| 0.7784722222222222 | 128.284 |
| 0.7791666666666667 | 128.284 |
| 0.779861111111111 | 128.284 |
| 0.7805555555555556 | 128.284 |
| 0.78125 | 123.758 |
| 0.7819444444444444 | 123.758 |
| 0.782638888888889 | 119.235 |
| 0.7833333333333333 | 119.235 |
| 0.7840277777777778 | 119.235 |
| 0.7847222222222222 | 114.716 |
| 0.7854166666666668 | 114.716 |
| 0.7861111111111111 | 114.716 |
| 0.7868055555555555 | 114.716 |
| 0.7875 | 114.716 |
| 0.7881944444444445 | 114.716 |
| 0.7888888888888889 | 114.716 |
| 0.7895833333333333 | 114.716 |
| 0.7902777777777777 | 119.235 |
| 0.7909722222222223 | 119.235 |
| 0.7916666666666666 | 119.235 |
| 0.7923611111111111 | 119.235 |
| 0.7930555555555556 | 123.758 |
| 0.7937500000000001 | 119.235 |
| 0.7944444444444444 | 119.235 |
| 0.7951388888888888 | 114.716 |
| 0.7958333333333334 | 114.716 |
| 0.7965277777777778 | 114.716 |
| 0.7972222222222222 | 114.716 |
| 0.7979166666666666 | 114.716 |
| 0.7986111111111112 | 114.716 |
| 0.7993055555555556 | 114.716 |
| 0.7999999999999999 | 114.716 |
| 0.8006944444444444 | 114.716 |
| 0.8013888888888889 | 110.201 |
| 0.8020833333333334 | 110.201 |
| 0.8027777777777777 | 110.201 |
| 0.8034722222222223 | 105.69 |
| 0.8041666666666667 | 101.184 |
| 0.8048611111111111 | 101.184 |
| 0.8055555555555555 | 101.184 |
| 0.80625 | 101.184 |
| 0.8069444444444445 | 101.184 |
| 0.8076388888888889 | 101.184 |
| 0.8083333333333332 | 96.682 |
| 0.8090277777777778 | 96.682 |
| 0.8097222222222222 | 92.184 |
| 0.8104166666666667 | 87.692 |
| 0.811111111111111 | 87.692 |
| 0.8118055555555556 | 83.205 |
| 0.8125 | 83.205 |
| 0.8131944444444444 | 78.722 |
| 0.813888888888889 | 74.246 |
| 0.8145833333333333 | 74.246 |
| 0.8152777777777778 | 69.775 |
| 0.8159722222222222 | 69.775 |
| 0.8166666666666668 | 65.31 |
| 0.8173611111111111 | 65.31 |
| 0.8180555555555555 | 60.85 |
| 0.81875 | 60.85 |
| 0.8194444444444445 | 56.398 |
| 0.8201388888888889 | 56.398 |
| 0.8208333333333333 | 51.951 |
| 0.8215277777777777 | 51.951 |
| 0.8222222222222223 | 51.951 |
| 0.8229166666666666 | 47.511 |
| 0.8236111111111111 | 47.511 |
| 0.8243055555555556 | 47.511 |
| 0.8250000000000001 | 47.511 |
| 0.8256944444444444 | 43.079 |
| 0.8263888888888888 | 43.079 |
| 0.8270833333333334 | 43.079 |
| 0.8277777777777778 | 43.079 |
| 0.8284722222222222 | 43.079 |
| 0.8291666666666666 | 38.653 |
| 0.8298611111111112 | 38.653 |
| 0.8305555555555556 | 38.653 |
| 0.8312499999999999 | 34.234 |
| 0.8319444444444444 | 34.234 |
| 0.8326388888888889 | 34.234 |
| 0.8333333333333334 | 29.823 |
| 0.8340277777777777 | 29.823 |
| 0.8347222222222223 | 29.823 |
| 0.8354166666666667 | 25.419 |
| 0.8361111111111111 | 25.419 |
| 0.8368055555555555 | 21.024 |
| 0.8375 | 21.024 |
| 0.8381944444444445 | 21.024 |
| 0.8388888888888889 | 16.636 |
| 0.8395833333333332 | 16.636 |
| 0.8402777777777778 | 16.636 |
| 0.8409722222222222 | 12.257 |
| 0.8416666666666667 | 12.257 |
| 0.842361111111111 | 12.257 |
| 0.8430555555555556 | 12.257 |
| 0.84375 | 12.257 |
| 0.8444444444444444 | 12.257 |
| 0.845138888888889 | 12.257 |
| 0.8458333333333333 | 12.257 |
| 0.8465277777777778 | 12.257 |
| 0.8472222222222222 | 12.257 |
| 0.8479166666666668 | 12.257 |
| 0.8486111111111111 | 7.887 |
| 0.8493055555555555 | 7.887 |
| 0.85 | 7.887 |
| 0.8506944444444445 | 7.887 |
| 0.8513888888888889 | 3.525 |
| 0.8520833333333333 | 3.525 |
| 0.8527777777777777 | 3.525 |
| 0.8534722222222223 | 3.525 |
| 0.8541666666666666 | 3.525 |
| 0.8548611111111111 | 3.525 |
| 0.8555555555555556 | 3.525 |
| 0.8562500000000001 | 0 |
| 0.8569444444444444 | 0 |
| 0.8576388888888888 | 0 |
| 0.8583333333333334 | 0 |
| 0.8590277777777778 | 0 |
| 0.8597222222222222 | 0 |
| 0.8604166666666666 | 0 |
| 0.8611111111111112 | 0 |
| 0.8618055555555556 | 0 |
| 0.8624999999999999 | 0 |
| 0.8631944444444444 | 0 |
| 0.8638888888888889 | 0 |
| 0.8645833333333334 | 0 |
| 0.8652777777777777 | 0 |
| 0.8659722222222223 | 0 |
| 0.8666666666666667 | 0 |
| 0.8673611111111111 | 0 |
| 0.8680555555555555 | 0 |
| 0.86875 | 0 |
| 0.8694444444444445 | 0 |
| 0.8701388888888889 | 0 |
| 0.8708333333333332 | 0 |
| 0.8715277777777778 | 0 |
| 0.8722222222222222 | 0 |
| 0.8729166666666667 | 0 |
| 0.873611111111111 | 0 |
| 0.8743055555555556 | 0 |
| 0.875 | 0 |
| 0.8756944444444444 | 0 |
| 0.876388888888889 | 0 |
| 0.8770833333333333 | 0 |
| 0.8777777777777778 | 0 |
| 0.8784722222222222 | 0 |
| 0.8791666666666668 | 0 |
| 0.8798611111111111 | 0 |
| 0.8805555555555555 | 0 |
| 0.88125 | 0 |
| 0.8819444444444445 | 0 |
| 0.8826388888888889 | 0 |
| 0.8833333333333333 | 0 |
| 0.8840277777777777 | 0 |
| 0.8847222222222223 | 0 |
| 0.8854166666666666 | 0 |
| 0.8861111111111111 | 0 |
| 0.8868055555555556 | 0 |
| 0.8875000000000001 | 0 |
| 0.8881944444444444 | 0 |
| 0.8888888888888888 | 0 |
| 0.8895833333333334 | 0 |
| 0.8902777777777778 | 0 |
| 0.8909722222222222 | 0 |
| 0.8916666666666666 | 0 |
| 0.8923611111111112 | 0 |
| 0.8930555555555556 | 0 |
| 0.8937499999999999 | 0 |
| 0.8944444444444444 | 0 |
| 0.8951388888888889 | 0 |
| 0.8958333333333334 | 0 |
| 0.8965277777777777 | 0 |
| 0.8972222222222223 | 0 |
| 0.8979166666666667 | 0 |
| 0.8986111111111111 | 0 |
| 0.8993055555555555 | 0 |
| 0.9 | 0 |
| 0.9006944444444445 | 0 |
| 0.9013888888888889 | 0 |
| 0.9020833333333332 | 0 |
| 0.9027777777777778 | 0 |
| 0.9034722222222222 | 0 |
| 0.9041666666666667 | 0 |
| 0.904861111111111 | 0 |
| 0.9055555555555556 | 0 |
| 0.90625 | 0 |
| 0.9069444444444444 | 0 |
| 0.907638888888889 | 0 |
| 0.9083333333333333 | 0 |
| 0.9090277777777778 | 0 |
| 0.9097222222222222 | 0 |
| 0.9104166666666668 | 0 |
| 0.9111111111111111 | 0 |
| 0.9118055555555555 | 0 |
| 0.9125 | 0 |
| 0.9131944444444445 | 0 |
| 0.9138888888888889 | 0 |
| 0.9145833333333333 | 0 |
| 0.9152777777777777 | 0 |
| 0.9159722222222223 | 0 |
| 0.9166666666666666 | 0 |
| 0.9173611111111111 | 0 |
| 0.9180555555555556 | 0 |
| 0.9187500000000001 | 0 |
| 0.9194444444444444 | 0 |
| 0.9201388888888888 | 0 |
| 0.9208333333333334 | 0 |
| 0.9215277777777778 | 0 |
| 0.9222222222222222 | 0 |
| 0.9229166666666666 | 0 |
| 0.9236111111111112 | 0 |
| 0.9243055555555556 | 0 |
| 0.9249999999999999 | 0 |
| 0.9256944444444444 | 0 |
| 0.9263888888888889 | 0 |
| 0.9270833333333334 | 0 |
| 0.9277777777777777 | 0 |
| 0.9284722222222223 | 0 |
| 0.9291666666666667 | 0 |
| 0.9298611111111111 | 0 |
| 0.9305555555555555 | 0 |
| 0.93125 | 0 |
| 0.9319444444444445 | 0 |
| 0.9326388888888889 | 0 |
| 0.9333333333333332 | 0 |
| 0.9340277777777778 | 0 |
| 0.9347222222222222 | 0 |
| 0.9354166666666667 | 0 |
| 0.936111111111111 | 0 |
| 0.9368055555555556 | 0 |
| 0.9375 | 0 |
| 0.9381944444444444 | 0 |
| 0.938888888888889 | 0 |
| 0.9395833333333333 | 0 |
| 0.9402777777777778 | 0 |
| 0.9409722222222222 | 0 |
| 0.9416666666666668 | 0 |
| 0.9423611111111111 | 0 |
| 0.9430555555555555 | 0 |
| 0.94375 | 0 |
| 0.9444444444444445 | 0 |
| 0.9451388888888889 | 0 |
| 0.9458333333333333 | 0 |
| 0.9465277777777777 | 0 |
| 0.9472222222222223 | 0 |
| 0.9479166666666666 | 0 |
| 0.9486111111111111 | 0 |
| 0.9493055555555556 | 0 |
| 0.9500000000000001 | 0 |
| 0.9506944444444444 | 0 |
| 0.9513888888888888 | 0 |
| 0.9520833333333334 | 0 |
| 0.9527777777777778 | 0 |
| 0.9534722222222222 | 0 |
| 0.9541666666666666 | 0 |
| 0.9548611111111112 | 0 |
| 0.9555555555555556 | 0 |
| 0.9562499999999999 | 0 |
| 0.9569444444444444 | 0 |
| 0.9576388888888889 | 0 |
| 0.9583333333333334 | 0 |
| 0.9590277777777777 | 0 |
| 0.9597222222222223 | 0 |
| 0.9604166666666667 | 0 |
| 0.9611111111111111 | 0 |
| 0.9618055555555555 | 0 |
| 0.9625 | 0 |
| 0.9631944444444445 | 0 |
| 0.9638888888888889 | 0 |
| 0.9645833333333332 | 0 |
| 0.9652777777777778 | 0 |
| 0.9659722222222222 | 0 |
| 0.9666666666666667 | 0 |
| 0.967361111111111 | 0 |
| 0.9680555555555556 | 0 |
| 0.96875 | 0 |
| 0.9694444444444444 | 0 |
| 0.970138888888889 | 0 |
| 0.9708333333333333 | 0 |
| 0.9715277777777778 | 0 |
| 0.9722222222222222 | 0 |
| 0.9729166666666668 | 0 |
| 0.9736111111111111 | 0 |
| 0.9743055555555555 | 0 |
| 0.975 | 0 |
| 0.9756944444444445 | 0 |
| 0.9763888888888889 | 0 |
| 0.9770833333333333 | 0 |
| 0.9777777777777777 | 0 |
| 0.9784722222222223 | 0 |
| 0.9791666666666666 | 0 |
| 0.9798611111111111 | 0 |
| 0.9805555555555556 | 0 |
| 0.9812500000000001 | 0 |
| 0.9819444444444444 | 0 |
| 0.9826388888888888 | 0 |
| 0.9833333333333334 | 0 |
| 0.9840277777777778 | 0 |
| 0.9847222222222222 | 0 |
| 0.9854166666666666 | 0 |
| 0.9861111111111112 | 0 |
| 0.9868055555555556 | 0 |
| 0.9874999999999999 | 0 |
| 0.9881944444444444 | 0 |
| 0.9888888888888889 | 0 |
| 0.9895833333333334 | 0 |
| 0.9902777777777777 | 0 |
| 0.9909722222222223 | 0 |
| 0.9916666666666667 | 0 |
| 0.9923611111111111 | 0 |
| 0.9930555555555555 | 0 |
| 0.99375 | 0 |
| 0.9944444444444445 | 0 |
| 0.9951388888888889 | 0 |
| 0.9958333333333332 | 0 |
| 0.9965277777777778 | 0 |
| 0.9972222222222222 | 0 |
| 0.9979166666666667 | 0 |
| 0.998611111111111 | 0 |
| 0.9993055555555556 | 0 |